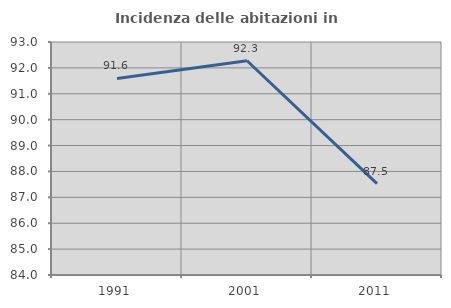
| Category | Incidenza delle abitazioni in proprietà  |
|---|---|
| 1991.0 | 91.59 |
| 2001.0 | 92.276 |
| 2011.0 | 87.531 |